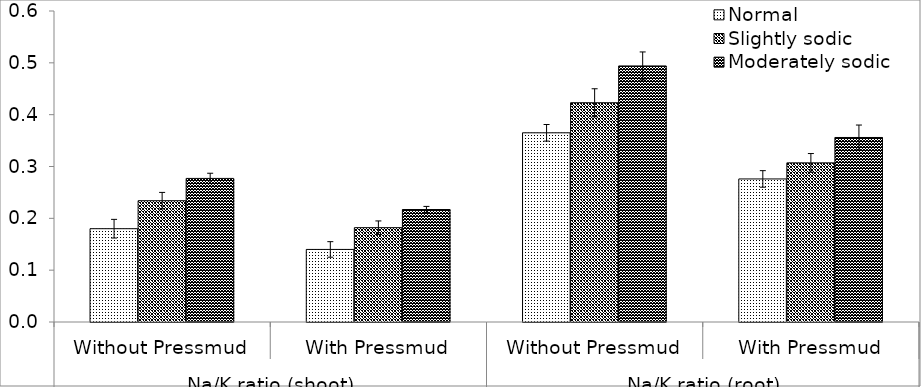
| Category | Normal | Slightly sodic | Moderately sodic |
|---|---|---|---|
| 0 | 0.18 | 0.234 | 0.277 |
| 1 | 0.14 | 0.182 | 0.217 |
| 2 | 0.365 | 0.423 | 0.494 |
| 3 | 0.276 | 0.307 | 0.356 |